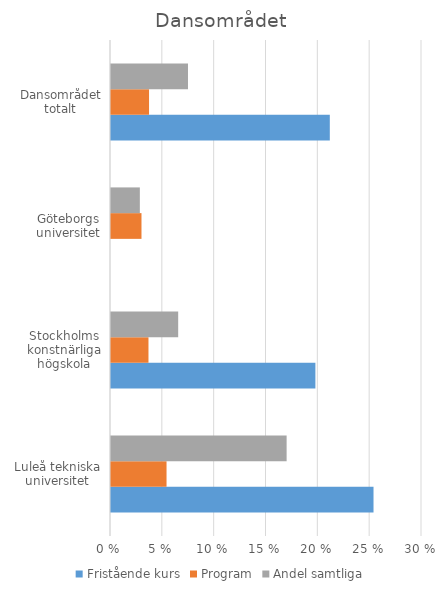
| Category | Fristående kurs | Program | Andel samtliga |
|---|---|---|---|
| Luleå tekniska universitet | 0.253 | 0.054 | 0.169 |
| Stockholms konstnärliga högskola | 0.197 | 0.036 | 0.065 |
| Göteborgs universitet | 0 | 0.029 | 0.028 |
| Dansområdet totalt | 0.211 | 0.037 | 0.074 |